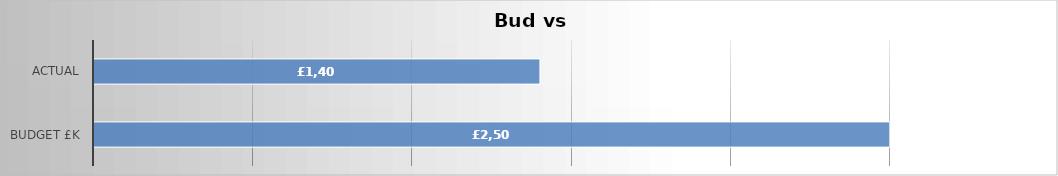
| Category | Series 0 |
|---|---|
| Budget £k | 2500 |
| Actual | 1400.84 |